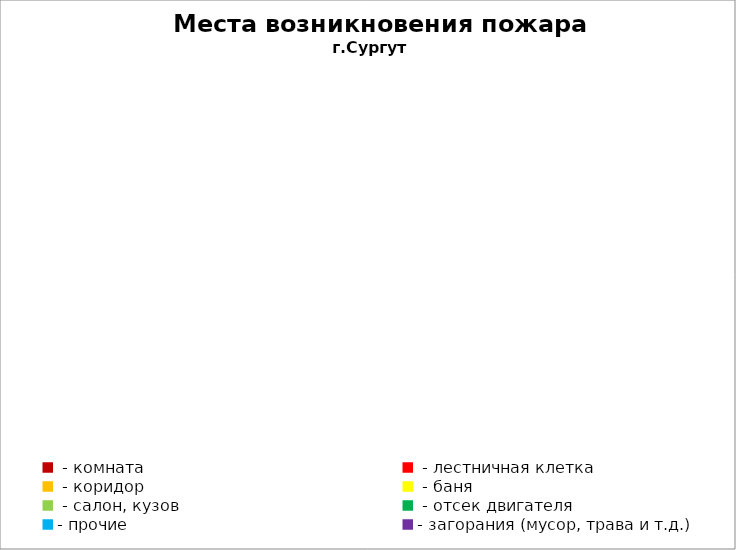
| Category | Места возникновения пожара |
|---|---|
|  - комната | 4 |
|  - лестничная клетка | 1 |
|  - коридор | 0 |
|  - баня | 2 |
|  - салон, кузов | 2 |
|  - отсек двигателя | 12 |
| - прочие | 28 |
| - загорания (мусор, трава и т.д.)  | 4 |